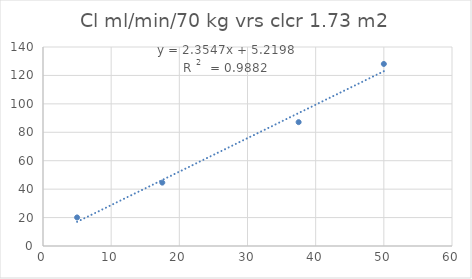
| Category | Series 0 |
|---|---|
| 50.0 | 128.083 |
| 37.5 | 87.132 |
| 17.5 | 44.59 |
| 5.0 | 20.096 |